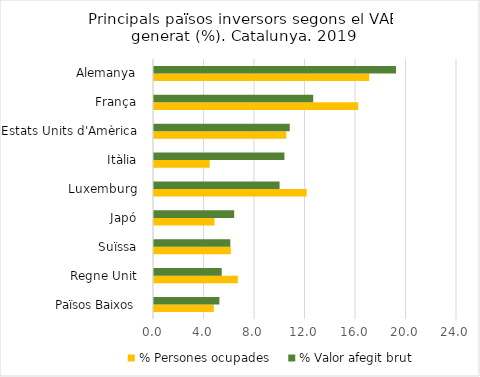
| Category | % Persones ocupades | % Valor afegit brut |
|---|---|---|
| Països Baixos  | 4.742 | 5.18 |
| Regne Unit  | 6.645 | 5.364 |
| Suïssa  | 6.086 | 6.046 |
| Japó  | 4.792 | 6.351 |
| Luxemburg  | 12.094 | 9.947 |
| Itàlia  | 4.414 | 10.329 |
| Estats Units d'Amèrica  | 10.475 | 10.751 |
| França  | 16.174 | 12.612 |
| Alemanya  | 17.048 | 19.171 |